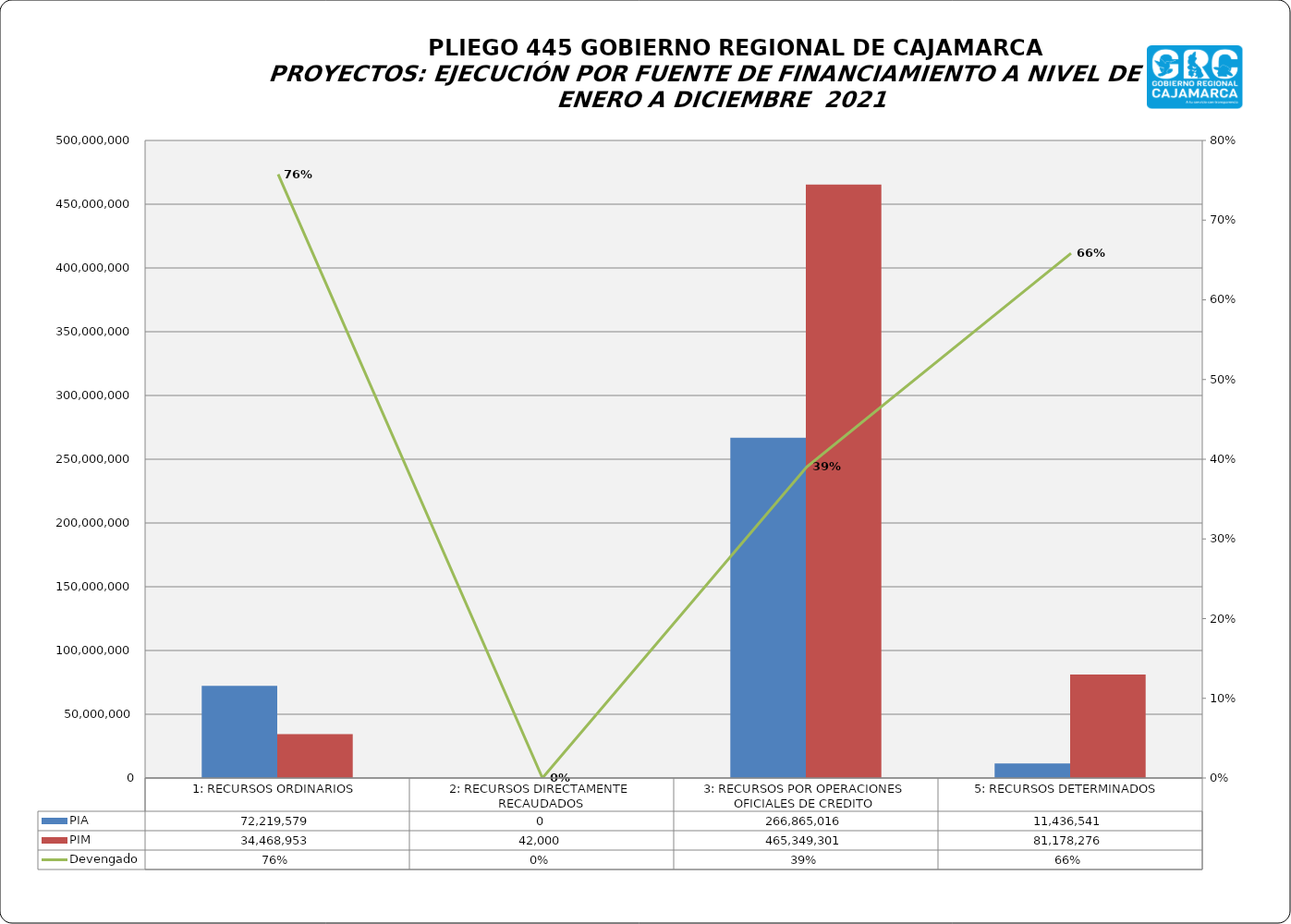
| Category | PIA | PIM |
|---|---|---|
| 1: RECURSOS ORDINARIOS | 72219579 | 34468953 |
| 2: RECURSOS DIRECTAMENTE RECAUDADOS | 0 | 42000 |
| 3: RECURSOS POR OPERACIONES OFICIALES DE CREDITO | 266865016 | 465349301 |
| 5: RECURSOS DETERMINADOS | 11436541 | 81178276 |